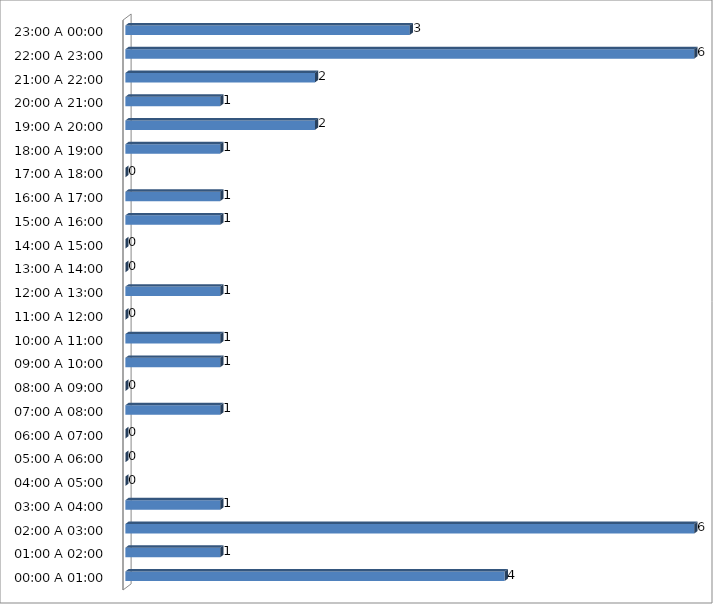
| Category | Series 0 |
|---|---|
| 00:00 A 01:00 | 4 |
| 01:00 A 02:00 | 1 |
| 02:00 A 03:00 | 6 |
| 03:00 A 04:00 | 1 |
| 04:00 A 05:00 | 0 |
| 05:00 A 06:00 | 0 |
| 06:00 A 07:00 | 0 |
| 07:00 A 08:00 | 1 |
| 08:00 A 09:00 | 0 |
| 09:00 A 10:00 | 1 |
| 10:00 A 11:00 | 1 |
| 11:00 A 12:00 | 0 |
| 12:00 A 13:00 | 1 |
| 13:00 A 14:00 | 0 |
| 14:00 A 15:00 | 0 |
| 15:00 A 16:00 | 1 |
| 16:00 A 17:00 | 1 |
| 17:00 A 18:00 | 0 |
| 18:00 A 19:00 | 1 |
| 19:00 A 20:00 | 2 |
| 20:00 A 21:00 | 1 |
| 21:00 A 22:00 | 2 |
| 22:00 A 23:00 | 6 |
| 23:00 A 00:00 | 3 |